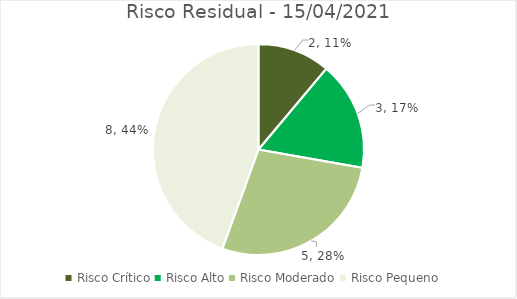
| Category | Series 0 |
|---|---|
| Risco Crítico | 2 |
| Risco Alto | 3 |
| Risco Moderado | 5 |
| Risco Pequeno | 8 |